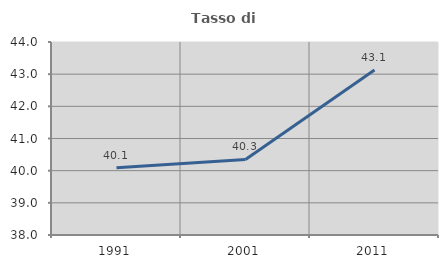
| Category | Tasso di occupazione   |
|---|---|
| 1991.0 | 40.092 |
| 2001.0 | 40.348 |
| 2011.0 | 43.13 |